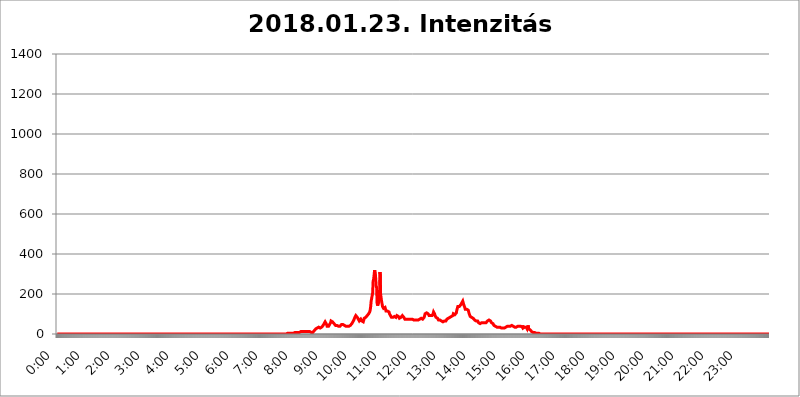
| Category | 2018.01.23. Intenzitás [W/m^2] |
|---|---|
| 0.0 | 0 |
| 0.0006944444444444445 | 0 |
| 0.001388888888888889 | 0 |
| 0.0020833333333333333 | 0 |
| 0.002777777777777778 | 0 |
| 0.003472222222222222 | 0 |
| 0.004166666666666667 | 0 |
| 0.004861111111111111 | 0 |
| 0.005555555555555556 | 0 |
| 0.0062499999999999995 | 0 |
| 0.006944444444444444 | 0 |
| 0.007638888888888889 | 0 |
| 0.008333333333333333 | 0 |
| 0.009027777777777779 | 0 |
| 0.009722222222222222 | 0 |
| 0.010416666666666666 | 0 |
| 0.011111111111111112 | 0 |
| 0.011805555555555555 | 0 |
| 0.012499999999999999 | 0 |
| 0.013194444444444444 | 0 |
| 0.013888888888888888 | 0 |
| 0.014583333333333332 | 0 |
| 0.015277777777777777 | 0 |
| 0.015972222222222224 | 0 |
| 0.016666666666666666 | 0 |
| 0.017361111111111112 | 0 |
| 0.018055555555555557 | 0 |
| 0.01875 | 0 |
| 0.019444444444444445 | 0 |
| 0.02013888888888889 | 0 |
| 0.020833333333333332 | 0 |
| 0.02152777777777778 | 0 |
| 0.022222222222222223 | 0 |
| 0.02291666666666667 | 0 |
| 0.02361111111111111 | 0 |
| 0.024305555555555556 | 0 |
| 0.024999999999999998 | 0 |
| 0.025694444444444447 | 0 |
| 0.02638888888888889 | 0 |
| 0.027083333333333334 | 0 |
| 0.027777777777777776 | 0 |
| 0.02847222222222222 | 0 |
| 0.029166666666666664 | 0 |
| 0.029861111111111113 | 0 |
| 0.030555555555555555 | 0 |
| 0.03125 | 0 |
| 0.03194444444444445 | 0 |
| 0.03263888888888889 | 0 |
| 0.03333333333333333 | 0 |
| 0.034027777777777775 | 0 |
| 0.034722222222222224 | 0 |
| 0.035416666666666666 | 0 |
| 0.036111111111111115 | 0 |
| 0.03680555555555556 | 0 |
| 0.0375 | 0 |
| 0.03819444444444444 | 0 |
| 0.03888888888888889 | 0 |
| 0.03958333333333333 | 0 |
| 0.04027777777777778 | 0 |
| 0.04097222222222222 | 0 |
| 0.041666666666666664 | 0 |
| 0.042361111111111106 | 0 |
| 0.04305555555555556 | 0 |
| 0.043750000000000004 | 0 |
| 0.044444444444444446 | 0 |
| 0.04513888888888889 | 0 |
| 0.04583333333333334 | 0 |
| 0.04652777777777778 | 0 |
| 0.04722222222222222 | 0 |
| 0.04791666666666666 | 0 |
| 0.04861111111111111 | 0 |
| 0.049305555555555554 | 0 |
| 0.049999999999999996 | 0 |
| 0.05069444444444445 | 0 |
| 0.051388888888888894 | 0 |
| 0.052083333333333336 | 0 |
| 0.05277777777777778 | 0 |
| 0.05347222222222222 | 0 |
| 0.05416666666666667 | 0 |
| 0.05486111111111111 | 0 |
| 0.05555555555555555 | 0 |
| 0.05625 | 0 |
| 0.05694444444444444 | 0 |
| 0.057638888888888885 | 0 |
| 0.05833333333333333 | 0 |
| 0.05902777777777778 | 0 |
| 0.059722222222222225 | 0 |
| 0.06041666666666667 | 0 |
| 0.061111111111111116 | 0 |
| 0.06180555555555556 | 0 |
| 0.0625 | 0 |
| 0.06319444444444444 | 0 |
| 0.06388888888888888 | 0 |
| 0.06458333333333334 | 0 |
| 0.06527777777777778 | 0 |
| 0.06597222222222222 | 0 |
| 0.06666666666666667 | 0 |
| 0.06736111111111111 | 0 |
| 0.06805555555555555 | 0 |
| 0.06874999999999999 | 0 |
| 0.06944444444444443 | 0 |
| 0.07013888888888889 | 0 |
| 0.07083333333333333 | 0 |
| 0.07152777777777779 | 0 |
| 0.07222222222222223 | 0 |
| 0.07291666666666667 | 0 |
| 0.07361111111111111 | 0 |
| 0.07430555555555556 | 0 |
| 0.075 | 0 |
| 0.07569444444444444 | 0 |
| 0.0763888888888889 | 0 |
| 0.07708333333333334 | 0 |
| 0.07777777777777778 | 0 |
| 0.07847222222222222 | 0 |
| 0.07916666666666666 | 0 |
| 0.0798611111111111 | 0 |
| 0.08055555555555556 | 0 |
| 0.08125 | 0 |
| 0.08194444444444444 | 0 |
| 0.08263888888888889 | 0 |
| 0.08333333333333333 | 0 |
| 0.08402777777777777 | 0 |
| 0.08472222222222221 | 0 |
| 0.08541666666666665 | 0 |
| 0.08611111111111112 | 0 |
| 0.08680555555555557 | 0 |
| 0.08750000000000001 | 0 |
| 0.08819444444444445 | 0 |
| 0.08888888888888889 | 0 |
| 0.08958333333333333 | 0 |
| 0.09027777777777778 | 0 |
| 0.09097222222222222 | 0 |
| 0.09166666666666667 | 0 |
| 0.09236111111111112 | 0 |
| 0.09305555555555556 | 0 |
| 0.09375 | 0 |
| 0.09444444444444444 | 0 |
| 0.09513888888888888 | 0 |
| 0.09583333333333333 | 0 |
| 0.09652777777777777 | 0 |
| 0.09722222222222222 | 0 |
| 0.09791666666666667 | 0 |
| 0.09861111111111111 | 0 |
| 0.09930555555555555 | 0 |
| 0.09999999999999999 | 0 |
| 0.10069444444444443 | 0 |
| 0.1013888888888889 | 0 |
| 0.10208333333333335 | 0 |
| 0.10277777777777779 | 0 |
| 0.10347222222222223 | 0 |
| 0.10416666666666667 | 0 |
| 0.10486111111111111 | 0 |
| 0.10555555555555556 | 0 |
| 0.10625 | 0 |
| 0.10694444444444444 | 0 |
| 0.1076388888888889 | 0 |
| 0.10833333333333334 | 0 |
| 0.10902777777777778 | 0 |
| 0.10972222222222222 | 0 |
| 0.1111111111111111 | 0 |
| 0.11180555555555556 | 0 |
| 0.11180555555555556 | 0 |
| 0.1125 | 0 |
| 0.11319444444444444 | 0 |
| 0.11388888888888889 | 0 |
| 0.11458333333333333 | 0 |
| 0.11527777777777777 | 0 |
| 0.11597222222222221 | 0 |
| 0.11666666666666665 | 0 |
| 0.1173611111111111 | 0 |
| 0.11805555555555557 | 0 |
| 0.11944444444444445 | 0 |
| 0.12013888888888889 | 0 |
| 0.12083333333333333 | 0 |
| 0.12152777777777778 | 0 |
| 0.12222222222222223 | 0 |
| 0.12291666666666667 | 0 |
| 0.12291666666666667 | 0 |
| 0.12361111111111112 | 0 |
| 0.12430555555555556 | 0 |
| 0.125 | 0 |
| 0.12569444444444444 | 0 |
| 0.12638888888888888 | 0 |
| 0.12708333333333333 | 0 |
| 0.16875 | 0 |
| 0.12847222222222224 | 0 |
| 0.12916666666666668 | 0 |
| 0.12986111111111112 | 0 |
| 0.13055555555555556 | 0 |
| 0.13125 | 0 |
| 0.13194444444444445 | 0 |
| 0.1326388888888889 | 0 |
| 0.13333333333333333 | 0 |
| 0.13402777777777777 | 0 |
| 0.13402777777777777 | 0 |
| 0.13472222222222222 | 0 |
| 0.13541666666666666 | 0 |
| 0.1361111111111111 | 0 |
| 0.13749999999999998 | 0 |
| 0.13819444444444443 | 0 |
| 0.1388888888888889 | 0 |
| 0.13958333333333334 | 0 |
| 0.14027777777777778 | 0 |
| 0.14097222222222222 | 0 |
| 0.14166666666666666 | 0 |
| 0.1423611111111111 | 0 |
| 0.14305555555555557 | 0 |
| 0.14375000000000002 | 0 |
| 0.14444444444444446 | 0 |
| 0.1451388888888889 | 0 |
| 0.1451388888888889 | 0 |
| 0.14652777777777778 | 0 |
| 0.14722222222222223 | 0 |
| 0.14791666666666667 | 0 |
| 0.1486111111111111 | 0 |
| 0.14930555555555555 | 0 |
| 0.15 | 0 |
| 0.15069444444444444 | 0 |
| 0.15138888888888888 | 0 |
| 0.15208333333333332 | 0 |
| 0.15277777777777776 | 0 |
| 0.15347222222222223 | 0 |
| 0.15416666666666667 | 0 |
| 0.15486111111111112 | 0 |
| 0.15555555555555556 | 0 |
| 0.15625 | 0 |
| 0.15694444444444444 | 0 |
| 0.15763888888888888 | 0 |
| 0.15833333333333333 | 0 |
| 0.15902777777777777 | 0 |
| 0.15972222222222224 | 0 |
| 0.16041666666666668 | 0 |
| 0.16111111111111112 | 0 |
| 0.16180555555555556 | 0 |
| 0.1625 | 0 |
| 0.16319444444444445 | 0 |
| 0.1638888888888889 | 0 |
| 0.16458333333333333 | 0 |
| 0.16527777777777777 | 0 |
| 0.16597222222222222 | 0 |
| 0.16666666666666666 | 0 |
| 0.1673611111111111 | 0 |
| 0.16805555555555554 | 0 |
| 0.16874999999999998 | 0 |
| 0.16944444444444443 | 0 |
| 0.17013888888888887 | 0 |
| 0.1708333333333333 | 0 |
| 0.17152777777777775 | 0 |
| 0.17222222222222225 | 0 |
| 0.1729166666666667 | 0 |
| 0.17361111111111113 | 0 |
| 0.17430555555555557 | 0 |
| 0.17500000000000002 | 0 |
| 0.17569444444444446 | 0 |
| 0.1763888888888889 | 0 |
| 0.17708333333333334 | 0 |
| 0.17777777777777778 | 0 |
| 0.17847222222222223 | 0 |
| 0.17916666666666667 | 0 |
| 0.1798611111111111 | 0 |
| 0.18055555555555555 | 0 |
| 0.18125 | 0 |
| 0.18194444444444444 | 0 |
| 0.1826388888888889 | 0 |
| 0.18333333333333335 | 0 |
| 0.1840277777777778 | 0 |
| 0.18472222222222223 | 0 |
| 0.18541666666666667 | 0 |
| 0.18611111111111112 | 0 |
| 0.18680555555555556 | 0 |
| 0.1875 | 0 |
| 0.18819444444444444 | 0 |
| 0.18888888888888888 | 0 |
| 0.18958333333333333 | 0 |
| 0.19027777777777777 | 0 |
| 0.1909722222222222 | 0 |
| 0.19166666666666665 | 0 |
| 0.19236111111111112 | 0 |
| 0.19305555555555554 | 0 |
| 0.19375 | 0 |
| 0.19444444444444445 | 0 |
| 0.1951388888888889 | 0 |
| 0.19583333333333333 | 0 |
| 0.19652777777777777 | 0 |
| 0.19722222222222222 | 0 |
| 0.19791666666666666 | 0 |
| 0.1986111111111111 | 0 |
| 0.19930555555555554 | 0 |
| 0.19999999999999998 | 0 |
| 0.20069444444444443 | 0 |
| 0.20138888888888887 | 0 |
| 0.2020833333333333 | 0 |
| 0.2027777777777778 | 0 |
| 0.2034722222222222 | 0 |
| 0.2041666666666667 | 0 |
| 0.20486111111111113 | 0 |
| 0.20555555555555557 | 0 |
| 0.20625000000000002 | 0 |
| 0.20694444444444446 | 0 |
| 0.2076388888888889 | 0 |
| 0.20833333333333334 | 0 |
| 0.20902777777777778 | 0 |
| 0.20972222222222223 | 0 |
| 0.21041666666666667 | 0 |
| 0.2111111111111111 | 0 |
| 0.21180555555555555 | 0 |
| 0.2125 | 0 |
| 0.21319444444444444 | 0 |
| 0.2138888888888889 | 0 |
| 0.21458333333333335 | 0 |
| 0.2152777777777778 | 0 |
| 0.21597222222222223 | 0 |
| 0.21666666666666667 | 0 |
| 0.21736111111111112 | 0 |
| 0.21805555555555556 | 0 |
| 0.21875 | 0 |
| 0.21944444444444444 | 0 |
| 0.22013888888888888 | 0 |
| 0.22083333333333333 | 0 |
| 0.22152777777777777 | 0 |
| 0.2222222222222222 | 0 |
| 0.22291666666666665 | 0 |
| 0.2236111111111111 | 0 |
| 0.22430555555555556 | 0 |
| 0.225 | 0 |
| 0.22569444444444445 | 0 |
| 0.2263888888888889 | 0 |
| 0.22708333333333333 | 0 |
| 0.22777777777777777 | 0 |
| 0.22847222222222222 | 0 |
| 0.22916666666666666 | 0 |
| 0.2298611111111111 | 0 |
| 0.23055555555555554 | 0 |
| 0.23124999999999998 | 0 |
| 0.23194444444444443 | 0 |
| 0.23263888888888887 | 0 |
| 0.2333333333333333 | 0 |
| 0.2340277777777778 | 0 |
| 0.2347222222222222 | 0 |
| 0.2354166666666667 | 0 |
| 0.23611111111111113 | 0 |
| 0.23680555555555557 | 0 |
| 0.23750000000000002 | 0 |
| 0.23819444444444446 | 0 |
| 0.2388888888888889 | 0 |
| 0.23958333333333334 | 0 |
| 0.24027777777777778 | 0 |
| 0.24097222222222223 | 0 |
| 0.24166666666666667 | 0 |
| 0.2423611111111111 | 0 |
| 0.24305555555555555 | 0 |
| 0.24375 | 0 |
| 0.24444444444444446 | 0 |
| 0.24513888888888888 | 0 |
| 0.24583333333333335 | 0 |
| 0.2465277777777778 | 0 |
| 0.24722222222222223 | 0 |
| 0.24791666666666667 | 0 |
| 0.24861111111111112 | 0 |
| 0.24930555555555556 | 0 |
| 0.25 | 0 |
| 0.25069444444444444 | 0 |
| 0.2513888888888889 | 0 |
| 0.2520833333333333 | 0 |
| 0.25277777777777777 | 0 |
| 0.2534722222222222 | 0 |
| 0.25416666666666665 | 0 |
| 0.2548611111111111 | 0 |
| 0.2555555555555556 | 0 |
| 0.25625000000000003 | 0 |
| 0.2569444444444445 | 0 |
| 0.2576388888888889 | 0 |
| 0.25833333333333336 | 0 |
| 0.2590277777777778 | 0 |
| 0.25972222222222224 | 0 |
| 0.2604166666666667 | 0 |
| 0.2611111111111111 | 0 |
| 0.26180555555555557 | 0 |
| 0.2625 | 0 |
| 0.26319444444444445 | 0 |
| 0.2638888888888889 | 0 |
| 0.26458333333333334 | 0 |
| 0.2652777777777778 | 0 |
| 0.2659722222222222 | 0 |
| 0.26666666666666666 | 0 |
| 0.2673611111111111 | 0 |
| 0.26805555555555555 | 0 |
| 0.26875 | 0 |
| 0.26944444444444443 | 0 |
| 0.2701388888888889 | 0 |
| 0.2708333333333333 | 0 |
| 0.27152777777777776 | 0 |
| 0.2722222222222222 | 0 |
| 0.27291666666666664 | 0 |
| 0.2736111111111111 | 0 |
| 0.2743055555555555 | 0 |
| 0.27499999999999997 | 0 |
| 0.27569444444444446 | 0 |
| 0.27638888888888885 | 0 |
| 0.27708333333333335 | 0 |
| 0.2777777777777778 | 0 |
| 0.27847222222222223 | 0 |
| 0.2791666666666667 | 0 |
| 0.2798611111111111 | 0 |
| 0.28055555555555556 | 0 |
| 0.28125 | 0 |
| 0.28194444444444444 | 0 |
| 0.2826388888888889 | 0 |
| 0.2833333333333333 | 0 |
| 0.28402777777777777 | 0 |
| 0.2847222222222222 | 0 |
| 0.28541666666666665 | 0 |
| 0.28611111111111115 | 0 |
| 0.28680555555555554 | 0 |
| 0.28750000000000003 | 0 |
| 0.2881944444444445 | 0 |
| 0.2888888888888889 | 0 |
| 0.28958333333333336 | 0 |
| 0.2902777777777778 | 0 |
| 0.29097222222222224 | 0 |
| 0.2916666666666667 | 0 |
| 0.2923611111111111 | 0 |
| 0.29305555555555557 | 0 |
| 0.29375 | 0 |
| 0.29444444444444445 | 0 |
| 0.2951388888888889 | 0 |
| 0.29583333333333334 | 0 |
| 0.2965277777777778 | 0 |
| 0.2972222222222222 | 0 |
| 0.29791666666666666 | 0 |
| 0.2986111111111111 | 0 |
| 0.29930555555555555 | 0 |
| 0.3 | 0 |
| 0.30069444444444443 | 0 |
| 0.3013888888888889 | 0 |
| 0.3020833333333333 | 0 |
| 0.30277777777777776 | 0 |
| 0.3034722222222222 | 0 |
| 0.30416666666666664 | 0 |
| 0.3048611111111111 | 0 |
| 0.3055555555555555 | 0 |
| 0.30624999999999997 | 0 |
| 0.3069444444444444 | 0 |
| 0.3076388888888889 | 0 |
| 0.30833333333333335 | 0 |
| 0.3090277777777778 | 0 |
| 0.30972222222222223 | 0 |
| 0.3104166666666667 | 0 |
| 0.3111111111111111 | 0 |
| 0.31180555555555556 | 0 |
| 0.3125 | 0 |
| 0.31319444444444444 | 0 |
| 0.3138888888888889 | 0 |
| 0.3145833333333333 | 0 |
| 0.31527777777777777 | 0 |
| 0.3159722222222222 | 0 |
| 0.31666666666666665 | 0 |
| 0.31736111111111115 | 0 |
| 0.31805555555555554 | 0 |
| 0.31875000000000003 | 0 |
| 0.3194444444444445 | 0 |
| 0.3201388888888889 | 0 |
| 0.32083333333333336 | 0 |
| 0.3215277777777778 | 0 |
| 0.32222222222222224 | 3.525 |
| 0.3229166666666667 | 3.525 |
| 0.3236111111111111 | 0 |
| 0.32430555555555557 | 3.525 |
| 0.325 | 3.525 |
| 0.32569444444444445 | 3.525 |
| 0.3263888888888889 | 3.525 |
| 0.32708333333333334 | 3.525 |
| 0.3277777777777778 | 3.525 |
| 0.3284722222222222 | 3.525 |
| 0.32916666666666666 | 3.525 |
| 0.3298611111111111 | 3.525 |
| 0.33055555555555555 | 3.525 |
| 0.33125 | 3.525 |
| 0.33194444444444443 | 3.525 |
| 0.3326388888888889 | 3.525 |
| 0.3333333333333333 | 7.887 |
| 0.3340277777777778 | 7.887 |
| 0.3347222222222222 | 7.887 |
| 0.3354166666666667 | 7.887 |
| 0.3361111111111111 | 7.887 |
| 0.3368055555555556 | 7.887 |
| 0.33749999999999997 | 7.887 |
| 0.33819444444444446 | 7.887 |
| 0.33888888888888885 | 7.887 |
| 0.33958333333333335 | 7.887 |
| 0.34027777777777773 | 12.257 |
| 0.34097222222222223 | 12.257 |
| 0.3416666666666666 | 12.257 |
| 0.3423611111111111 | 12.257 |
| 0.3430555555555555 | 12.257 |
| 0.34375 | 12.257 |
| 0.3444444444444445 | 12.257 |
| 0.3451388888888889 | 12.257 |
| 0.3458333333333334 | 12.257 |
| 0.34652777777777777 | 12.257 |
| 0.34722222222222227 | 12.257 |
| 0.34791666666666665 | 12.257 |
| 0.34861111111111115 | 12.257 |
| 0.34930555555555554 | 12.257 |
| 0.35000000000000003 | 12.257 |
| 0.3506944444444444 | 12.257 |
| 0.3513888888888889 | 12.257 |
| 0.3520833333333333 | 12.257 |
| 0.3527777777777778 | 12.257 |
| 0.3534722222222222 | 12.257 |
| 0.3541666666666667 | 12.257 |
| 0.3548611111111111 | 7.887 |
| 0.35555555555555557 | 7.887 |
| 0.35625 | 7.887 |
| 0.35694444444444445 | 3.525 |
| 0.3576388888888889 | 7.887 |
| 0.35833333333333334 | 7.887 |
| 0.3590277777777778 | 7.887 |
| 0.3597222222222222 | 12.257 |
| 0.36041666666666666 | 16.636 |
| 0.3611111111111111 | 21.024 |
| 0.36180555555555555 | 21.024 |
| 0.3625 | 25.419 |
| 0.36319444444444443 | 29.823 |
| 0.3638888888888889 | 29.823 |
| 0.3645833333333333 | 29.823 |
| 0.3652777777777778 | 34.234 |
| 0.3659722222222222 | 34.234 |
| 0.3666666666666667 | 34.234 |
| 0.3673611111111111 | 34.234 |
| 0.3680555555555556 | 29.823 |
| 0.36874999999999997 | 29.823 |
| 0.36944444444444446 | 29.823 |
| 0.37013888888888885 | 29.823 |
| 0.37083333333333335 | 34.234 |
| 0.37152777777777773 | 38.653 |
| 0.37222222222222223 | 38.653 |
| 0.3729166666666666 | 43.079 |
| 0.3736111111111111 | 47.511 |
| 0.3743055555555555 | 51.951 |
| 0.375 | 56.398 |
| 0.3756944444444445 | 60.85 |
| 0.3763888888888889 | 60.85 |
| 0.3770833333333334 | 60.85 |
| 0.37777777777777777 | 47.511 |
| 0.37847222222222227 | 38.653 |
| 0.37916666666666665 | 34.234 |
| 0.37986111111111115 | 34.234 |
| 0.38055555555555554 | 38.653 |
| 0.38125000000000003 | 43.079 |
| 0.3819444444444444 | 47.511 |
| 0.3826388888888889 | 51.951 |
| 0.3833333333333333 | 56.398 |
| 0.3840277777777778 | 65.31 |
| 0.3847222222222222 | 69.775 |
| 0.3854166666666667 | 65.31 |
| 0.3861111111111111 | 60.85 |
| 0.38680555555555557 | 60.85 |
| 0.3875 | 56.398 |
| 0.38819444444444445 | 51.951 |
| 0.3888888888888889 | 47.511 |
| 0.38958333333333334 | 47.511 |
| 0.3902777777777778 | 43.079 |
| 0.3909722222222222 | 38.653 |
| 0.39166666666666666 | 38.653 |
| 0.3923611111111111 | 43.079 |
| 0.39305555555555555 | 43.079 |
| 0.39375 | 43.079 |
| 0.39444444444444443 | 38.653 |
| 0.3951388888888889 | 38.653 |
| 0.3958333333333333 | 38.653 |
| 0.3965277777777778 | 38.653 |
| 0.3972222222222222 | 38.653 |
| 0.3979166666666667 | 43.079 |
| 0.3986111111111111 | 47.511 |
| 0.3993055555555556 | 47.511 |
| 0.39999999999999997 | 51.951 |
| 0.40069444444444446 | 47.511 |
| 0.40138888888888885 | 47.511 |
| 0.40208333333333335 | 47.511 |
| 0.40277777777777773 | 43.079 |
| 0.40347222222222223 | 38.653 |
| 0.4041666666666666 | 38.653 |
| 0.4048611111111111 | 38.653 |
| 0.4055555555555555 | 38.653 |
| 0.40625 | 38.653 |
| 0.4069444444444445 | 38.653 |
| 0.4076388888888889 | 38.653 |
| 0.4083333333333334 | 38.653 |
| 0.40902777777777777 | 38.653 |
| 0.40972222222222227 | 38.653 |
| 0.41041666666666665 | 38.653 |
| 0.41111111111111115 | 43.079 |
| 0.41180555555555554 | 43.079 |
| 0.41250000000000003 | 47.511 |
| 0.4131944444444444 | 51.951 |
| 0.4138888888888889 | 56.398 |
| 0.4145833333333333 | 60.85 |
| 0.4152777777777778 | 65.31 |
| 0.4159722222222222 | 69.775 |
| 0.4166666666666667 | 74.246 |
| 0.4173611111111111 | 83.205 |
| 0.41805555555555557 | 87.692 |
| 0.41875 | 92.184 |
| 0.41944444444444445 | 87.692 |
| 0.4201388888888889 | 87.692 |
| 0.42083333333333334 | 83.205 |
| 0.4215277777777778 | 78.722 |
| 0.4222222222222222 | 74.246 |
| 0.42291666666666666 | 69.775 |
| 0.4236111111111111 | 65.31 |
| 0.42430555555555555 | 65.31 |
| 0.425 | 69.775 |
| 0.42569444444444443 | 74.246 |
| 0.4263888888888889 | 69.775 |
| 0.4270833333333333 | 65.31 |
| 0.4277777777777778 | 60.85 |
| 0.4284722222222222 | 60.85 |
| 0.4291666666666667 | 60.85 |
| 0.4298611111111111 | 65.31 |
| 0.4305555555555556 | 78.722 |
| 0.43124999999999997 | 83.205 |
| 0.43194444444444446 | 83.205 |
| 0.43263888888888885 | 83.205 |
| 0.43333333333333335 | 83.205 |
| 0.43402777777777773 | 87.692 |
| 0.43472222222222223 | 92.184 |
| 0.4354166666666666 | 92.184 |
| 0.4361111111111111 | 96.682 |
| 0.4368055555555555 | 101.184 |
| 0.4375 | 105.69 |
| 0.4381944444444445 | 110.201 |
| 0.4388888888888889 | 119.235 |
| 0.4395833333333334 | 137.347 |
| 0.44027777777777777 | 164.605 |
| 0.44097222222222227 | 178.264 |
| 0.44166666666666665 | 182.82 |
| 0.44236111111111115 | 205.62 |
| 0.44305555555555554 | 264.932 |
| 0.44375000000000003 | 274.047 |
| 0.4444444444444444 | 296.808 |
| 0.4451388888888889 | 319.517 |
| 0.4458333333333333 | 314.98 |
| 0.4465277777777778 | 283.156 |
| 0.4472222222222222 | 242.127 |
| 0.4479166666666667 | 233 |
| 0.4486111111111111 | 155.509 |
| 0.44930555555555557 | 141.884 |
| 0.45 | 146.423 |
| 0.45069444444444445 | 160.056 |
| 0.4513888888888889 | 182.82 |
| 0.45208333333333334 | 210.182 |
| 0.4527777777777778 | 310.44 |
| 0.4534722222222222 | 201.058 |
| 0.45416666666666666 | 182.82 |
| 0.4548611111111111 | 164.605 |
| 0.45555555555555555 | 150.964 |
| 0.45625 | 137.347 |
| 0.45694444444444443 | 132.814 |
| 0.4576388888888889 | 128.284 |
| 0.4583333333333333 | 128.284 |
| 0.4590277777777778 | 132.814 |
| 0.4597222222222222 | 132.814 |
| 0.4604166666666667 | 123.758 |
| 0.4611111111111111 | 114.716 |
| 0.4618055555555556 | 110.201 |
| 0.46249999999999997 | 110.201 |
| 0.46319444444444446 | 114.716 |
| 0.46388888888888885 | 114.716 |
| 0.46458333333333335 | 114.716 |
| 0.46527777777777773 | 110.201 |
| 0.46597222222222223 | 101.184 |
| 0.4666666666666666 | 96.682 |
| 0.4673611111111111 | 92.184 |
| 0.4680555555555555 | 87.692 |
| 0.46875 | 83.205 |
| 0.4694444444444445 | 83.205 |
| 0.4701388888888889 | 87.692 |
| 0.4708333333333334 | 83.205 |
| 0.47152777777777777 | 83.205 |
| 0.47222222222222227 | 87.692 |
| 0.47291666666666665 | 87.692 |
| 0.47361111111111115 | 87.692 |
| 0.47430555555555554 | 87.692 |
| 0.47500000000000003 | 83.205 |
| 0.4756944444444444 | 83.205 |
| 0.4763888888888889 | 92.184 |
| 0.4770833333333333 | 92.184 |
| 0.4777777777777778 | 92.184 |
| 0.4784722222222222 | 87.692 |
| 0.4791666666666667 | 83.205 |
| 0.4798611111111111 | 78.722 |
| 0.48055555555555557 | 83.205 |
| 0.48125 | 83.205 |
| 0.48194444444444445 | 83.205 |
| 0.4826388888888889 | 83.205 |
| 0.48333333333333334 | 87.692 |
| 0.4840277777777778 | 92.184 |
| 0.4847222222222222 | 92.184 |
| 0.48541666666666666 | 87.692 |
| 0.4861111111111111 | 83.205 |
| 0.48680555555555555 | 78.722 |
| 0.4875 | 74.246 |
| 0.48819444444444443 | 74.246 |
| 0.4888888888888889 | 74.246 |
| 0.4895833333333333 | 74.246 |
| 0.4902777777777778 | 74.246 |
| 0.4909722222222222 | 74.246 |
| 0.4916666666666667 | 74.246 |
| 0.4923611111111111 | 74.246 |
| 0.4930555555555556 | 74.246 |
| 0.49374999999999997 | 74.246 |
| 0.49444444444444446 | 74.246 |
| 0.49513888888888885 | 74.246 |
| 0.49583333333333335 | 74.246 |
| 0.49652777777777773 | 74.246 |
| 0.49722222222222223 | 74.246 |
| 0.4979166666666666 | 74.246 |
| 0.4986111111111111 | 69.775 |
| 0.4993055555555555 | 69.775 |
| 0.5 | 69.775 |
| 0.5006944444444444 | 69.775 |
| 0.5013888888888889 | 69.775 |
| 0.5020833333333333 | 69.775 |
| 0.5027777777777778 | 69.775 |
| 0.5034722222222222 | 69.775 |
| 0.5041666666666667 | 69.775 |
| 0.5048611111111111 | 74.246 |
| 0.5055555555555555 | 74.246 |
| 0.50625 | 69.775 |
| 0.5069444444444444 | 69.775 |
| 0.5076388888888889 | 74.246 |
| 0.5083333333333333 | 74.246 |
| 0.5090277777777777 | 74.246 |
| 0.5097222222222222 | 78.722 |
| 0.5104166666666666 | 78.722 |
| 0.5111111111111112 | 78.722 |
| 0.5118055555555555 | 78.722 |
| 0.5125000000000001 | 74.246 |
| 0.5131944444444444 | 74.246 |
| 0.513888888888889 | 74.246 |
| 0.5145833333333333 | 83.205 |
| 0.5152777777777778 | 92.184 |
| 0.5159722222222222 | 101.184 |
| 0.5166666666666667 | 101.184 |
| 0.517361111111111 | 105.69 |
| 0.5180555555555556 | 105.69 |
| 0.5187499999999999 | 105.69 |
| 0.5194444444444445 | 105.69 |
| 0.5201388888888888 | 101.184 |
| 0.5208333333333334 | 96.682 |
| 0.5215277777777778 | 92.184 |
| 0.5222222222222223 | 92.184 |
| 0.5229166666666667 | 92.184 |
| 0.5236111111111111 | 92.184 |
| 0.5243055555555556 | 92.184 |
| 0.525 | 92.184 |
| 0.5256944444444445 | 92.184 |
| 0.5263888888888889 | 92.184 |
| 0.5270833333333333 | 101.184 |
| 0.5277777777777778 | 110.201 |
| 0.5284722222222222 | 110.201 |
| 0.5291666666666667 | 101.184 |
| 0.5298611111111111 | 92.184 |
| 0.5305555555555556 | 87.692 |
| 0.53125 | 83.205 |
| 0.5319444444444444 | 83.205 |
| 0.5326388888888889 | 83.205 |
| 0.5333333333333333 | 78.722 |
| 0.5340277777777778 | 74.246 |
| 0.5347222222222222 | 69.775 |
| 0.5354166666666667 | 69.775 |
| 0.5361111111111111 | 69.775 |
| 0.5368055555555555 | 69.775 |
| 0.5375 | 65.31 |
| 0.5381944444444444 | 65.31 |
| 0.5388888888888889 | 65.31 |
| 0.5395833333333333 | 65.31 |
| 0.5402777777777777 | 65.31 |
| 0.5409722222222222 | 60.85 |
| 0.5416666666666666 | 60.85 |
| 0.5423611111111112 | 60.85 |
| 0.5430555555555555 | 65.31 |
| 0.5437500000000001 | 65.31 |
| 0.5444444444444444 | 65.31 |
| 0.545138888888889 | 65.31 |
| 0.5458333333333333 | 69.775 |
| 0.5465277777777778 | 74.246 |
| 0.5472222222222222 | 74.246 |
| 0.5479166666666667 | 74.246 |
| 0.548611111111111 | 78.722 |
| 0.5493055555555556 | 78.722 |
| 0.5499999999999999 | 78.722 |
| 0.5506944444444445 | 83.205 |
| 0.5513888888888888 | 83.205 |
| 0.5520833333333334 | 87.692 |
| 0.5527777777777778 | 87.692 |
| 0.5534722222222223 | 87.692 |
| 0.5541666666666667 | 87.692 |
| 0.5548611111111111 | 92.184 |
| 0.5555555555555556 | 101.184 |
| 0.55625 | 105.69 |
| 0.5569444444444445 | 101.184 |
| 0.5576388888888889 | 96.682 |
| 0.5583333333333333 | 96.682 |
| 0.5590277777777778 | 96.682 |
| 0.5597222222222222 | 105.69 |
| 0.5604166666666667 | 119.235 |
| 0.5611111111111111 | 128.284 |
| 0.5618055555555556 | 137.347 |
| 0.5625 | 137.347 |
| 0.5631944444444444 | 137.347 |
| 0.5638888888888889 | 137.347 |
| 0.5645833333333333 | 137.347 |
| 0.5652777777777778 | 141.884 |
| 0.5659722222222222 | 146.423 |
| 0.5666666666666667 | 150.964 |
| 0.5673611111111111 | 155.509 |
| 0.5680555555555555 | 160.056 |
| 0.56875 | 164.605 |
| 0.5694444444444444 | 155.509 |
| 0.5701388888888889 | 146.423 |
| 0.5708333333333333 | 141.884 |
| 0.5715277777777777 | 132.814 |
| 0.5722222222222222 | 123.758 |
| 0.5729166666666666 | 123.758 |
| 0.5736111111111112 | 123.758 |
| 0.5743055555555555 | 123.758 |
| 0.5750000000000001 | 119.235 |
| 0.5756944444444444 | 123.758 |
| 0.576388888888889 | 119.235 |
| 0.5770833333333333 | 110.201 |
| 0.5777777777777778 | 101.184 |
| 0.5784722222222222 | 96.682 |
| 0.5791666666666667 | 87.692 |
| 0.579861111111111 | 83.205 |
| 0.5805555555555556 | 83.205 |
| 0.5812499999999999 | 83.205 |
| 0.5819444444444445 | 83.205 |
| 0.5826388888888888 | 78.722 |
| 0.5833333333333334 | 78.722 |
| 0.5840277777777778 | 74.246 |
| 0.5847222222222223 | 74.246 |
| 0.5854166666666667 | 69.775 |
| 0.5861111111111111 | 69.775 |
| 0.5868055555555556 | 69.775 |
| 0.5875 | 65.31 |
| 0.5881944444444445 | 65.31 |
| 0.5888888888888889 | 65.31 |
| 0.5895833333333333 | 65.31 |
| 0.5902777777777778 | 60.85 |
| 0.5909722222222222 | 56.398 |
| 0.5916666666666667 | 51.951 |
| 0.5923611111111111 | 51.951 |
| 0.5930555555555556 | 51.951 |
| 0.59375 | 51.951 |
| 0.5944444444444444 | 56.398 |
| 0.5951388888888889 | 56.398 |
| 0.5958333333333333 | 56.398 |
| 0.5965277777777778 | 56.398 |
| 0.5972222222222222 | 56.398 |
| 0.5979166666666667 | 56.398 |
| 0.5986111111111111 | 56.398 |
| 0.5993055555555555 | 56.398 |
| 0.6 | 56.398 |
| 0.6006944444444444 | 56.398 |
| 0.6013888888888889 | 56.398 |
| 0.6020833333333333 | 60.85 |
| 0.6027777777777777 | 60.85 |
| 0.6034722222222222 | 65.31 |
| 0.6041666666666666 | 65.31 |
| 0.6048611111111112 | 69.775 |
| 0.6055555555555555 | 69.775 |
| 0.6062500000000001 | 69.775 |
| 0.6069444444444444 | 65.31 |
| 0.607638888888889 | 65.31 |
| 0.6083333333333333 | 60.85 |
| 0.6090277777777778 | 56.398 |
| 0.6097222222222222 | 56.398 |
| 0.6104166666666667 | 51.951 |
| 0.611111111111111 | 51.951 |
| 0.6118055555555556 | 47.511 |
| 0.6124999999999999 | 43.079 |
| 0.6131944444444445 | 38.653 |
| 0.6138888888888888 | 38.653 |
| 0.6145833333333334 | 38.653 |
| 0.6152777777777778 | 38.653 |
| 0.6159722222222223 | 34.234 |
| 0.6166666666666667 | 34.234 |
| 0.6173611111111111 | 34.234 |
| 0.6180555555555556 | 34.234 |
| 0.61875 | 34.234 |
| 0.6194444444444445 | 34.234 |
| 0.6201388888888889 | 34.234 |
| 0.6208333333333333 | 34.234 |
| 0.6215277777777778 | 34.234 |
| 0.6222222222222222 | 29.823 |
| 0.6229166666666667 | 29.823 |
| 0.6236111111111111 | 29.823 |
| 0.6243055555555556 | 29.823 |
| 0.625 | 29.823 |
| 0.6256944444444444 | 25.419 |
| 0.6263888888888889 | 25.419 |
| 0.6270833333333333 | 29.823 |
| 0.6277777777777778 | 29.823 |
| 0.6284722222222222 | 29.823 |
| 0.6291666666666667 | 34.234 |
| 0.6298611111111111 | 34.234 |
| 0.6305555555555555 | 38.653 |
| 0.63125 | 38.653 |
| 0.6319444444444444 | 38.653 |
| 0.6326388888888889 | 38.653 |
| 0.6333333333333333 | 38.653 |
| 0.6340277777777777 | 38.653 |
| 0.6347222222222222 | 38.653 |
| 0.6354166666666666 | 38.653 |
| 0.6361111111111112 | 38.653 |
| 0.6368055555555555 | 43.079 |
| 0.6375000000000001 | 43.079 |
| 0.6381944444444444 | 38.653 |
| 0.638888888888889 | 38.653 |
| 0.6395833333333333 | 38.653 |
| 0.6402777777777778 | 34.234 |
| 0.6409722222222222 | 34.234 |
| 0.6416666666666667 | 34.234 |
| 0.642361111111111 | 34.234 |
| 0.6430555555555556 | 34.234 |
| 0.6437499999999999 | 34.234 |
| 0.6444444444444445 | 34.234 |
| 0.6451388888888888 | 34.234 |
| 0.6458333333333334 | 38.653 |
| 0.6465277777777778 | 38.653 |
| 0.6472222222222223 | 38.653 |
| 0.6479166666666667 | 38.653 |
| 0.6486111111111111 | 38.653 |
| 0.6493055555555556 | 38.653 |
| 0.65 | 38.653 |
| 0.6506944444444445 | 34.234 |
| 0.6513888888888889 | 34.234 |
| 0.6520833333333333 | 34.234 |
| 0.6527777777777778 | 43.079 |
| 0.6534722222222222 | 29.823 |
| 0.6541666666666667 | 29.823 |
| 0.6548611111111111 | 34.234 |
| 0.6555555555555556 | 34.234 |
| 0.65625 | 34.234 |
| 0.6569444444444444 | 29.823 |
| 0.6576388888888889 | 34.234 |
| 0.6583333333333333 | 29.823 |
| 0.6590277777777778 | 25.419 |
| 0.6597222222222222 | 34.234 |
| 0.6604166666666667 | 43.079 |
| 0.6611111111111111 | 25.419 |
| 0.6618055555555555 | 25.419 |
| 0.6625 | 29.823 |
| 0.6631944444444444 | 21.024 |
| 0.6638888888888889 | 21.024 |
| 0.6645833333333333 | 16.636 |
| 0.6652777777777777 | 12.257 |
| 0.6659722222222222 | 12.257 |
| 0.6666666666666666 | 12.257 |
| 0.6673611111111111 | 7.887 |
| 0.6680555555555556 | 7.887 |
| 0.6687500000000001 | 7.887 |
| 0.6694444444444444 | 7.887 |
| 0.6701388888888888 | 3.525 |
| 0.6708333333333334 | 3.525 |
| 0.6715277777777778 | 3.525 |
| 0.6722222222222222 | 3.525 |
| 0.6729166666666666 | 3.525 |
| 0.6736111111111112 | 3.525 |
| 0.6743055555555556 | 3.525 |
| 0.6749999999999999 | 3.525 |
| 0.6756944444444444 | 3.525 |
| 0.6763888888888889 | 3.525 |
| 0.6770833333333334 | 3.525 |
| 0.6777777777777777 | 0 |
| 0.6784722222222223 | 0 |
| 0.6791666666666667 | 0 |
| 0.6798611111111111 | 0 |
| 0.6805555555555555 | 0 |
| 0.68125 | 0 |
| 0.6819444444444445 | 0 |
| 0.6826388888888889 | 0 |
| 0.6833333333333332 | 0 |
| 0.6840277777777778 | 0 |
| 0.6847222222222222 | 0 |
| 0.6854166666666667 | 0 |
| 0.686111111111111 | 0 |
| 0.6868055555555556 | 0 |
| 0.6875 | 0 |
| 0.6881944444444444 | 0 |
| 0.688888888888889 | 0 |
| 0.6895833333333333 | 0 |
| 0.6902777777777778 | 0 |
| 0.6909722222222222 | 0 |
| 0.6916666666666668 | 0 |
| 0.6923611111111111 | 0 |
| 0.6930555555555555 | 0 |
| 0.69375 | 0 |
| 0.6944444444444445 | 0 |
| 0.6951388888888889 | 0 |
| 0.6958333333333333 | 0 |
| 0.6965277777777777 | 0 |
| 0.6972222222222223 | 0 |
| 0.6979166666666666 | 0 |
| 0.6986111111111111 | 0 |
| 0.6993055555555556 | 0 |
| 0.7000000000000001 | 0 |
| 0.7006944444444444 | 0 |
| 0.7013888888888888 | 0 |
| 0.7020833333333334 | 0 |
| 0.7027777777777778 | 0 |
| 0.7034722222222222 | 0 |
| 0.7041666666666666 | 0 |
| 0.7048611111111112 | 0 |
| 0.7055555555555556 | 0 |
| 0.7062499999999999 | 0 |
| 0.7069444444444444 | 0 |
| 0.7076388888888889 | 0 |
| 0.7083333333333334 | 0 |
| 0.7090277777777777 | 0 |
| 0.7097222222222223 | 0 |
| 0.7104166666666667 | 0 |
| 0.7111111111111111 | 0 |
| 0.7118055555555555 | 0 |
| 0.7125 | 0 |
| 0.7131944444444445 | 0 |
| 0.7138888888888889 | 0 |
| 0.7145833333333332 | 0 |
| 0.7152777777777778 | 0 |
| 0.7159722222222222 | 0 |
| 0.7166666666666667 | 0 |
| 0.717361111111111 | 0 |
| 0.7180555555555556 | 0 |
| 0.71875 | 0 |
| 0.7194444444444444 | 0 |
| 0.720138888888889 | 0 |
| 0.7208333333333333 | 0 |
| 0.7215277777777778 | 0 |
| 0.7222222222222222 | 0 |
| 0.7229166666666668 | 0 |
| 0.7236111111111111 | 0 |
| 0.7243055555555555 | 0 |
| 0.725 | 0 |
| 0.7256944444444445 | 0 |
| 0.7263888888888889 | 0 |
| 0.7270833333333333 | 0 |
| 0.7277777777777777 | 0 |
| 0.7284722222222223 | 0 |
| 0.7291666666666666 | 0 |
| 0.7298611111111111 | 0 |
| 0.7305555555555556 | 0 |
| 0.7312500000000001 | 0 |
| 0.7319444444444444 | 0 |
| 0.7326388888888888 | 0 |
| 0.7333333333333334 | 0 |
| 0.7340277777777778 | 0 |
| 0.7347222222222222 | 0 |
| 0.7354166666666666 | 0 |
| 0.7361111111111112 | 0 |
| 0.7368055555555556 | 0 |
| 0.7374999999999999 | 0 |
| 0.7381944444444444 | 0 |
| 0.7388888888888889 | 0 |
| 0.7395833333333334 | 0 |
| 0.7402777777777777 | 0 |
| 0.7409722222222223 | 0 |
| 0.7416666666666667 | 0 |
| 0.7423611111111111 | 0 |
| 0.7430555555555555 | 0 |
| 0.74375 | 0 |
| 0.7444444444444445 | 0 |
| 0.7451388888888889 | 0 |
| 0.7458333333333332 | 0 |
| 0.7465277777777778 | 0 |
| 0.7472222222222222 | 0 |
| 0.7479166666666667 | 0 |
| 0.748611111111111 | 0 |
| 0.7493055555555556 | 0 |
| 0.75 | 0 |
| 0.7506944444444444 | 0 |
| 0.751388888888889 | 0 |
| 0.7520833333333333 | 0 |
| 0.7527777777777778 | 0 |
| 0.7534722222222222 | 0 |
| 0.7541666666666668 | 0 |
| 0.7548611111111111 | 0 |
| 0.7555555555555555 | 0 |
| 0.75625 | 0 |
| 0.7569444444444445 | 0 |
| 0.7576388888888889 | 0 |
| 0.7583333333333333 | 0 |
| 0.7590277777777777 | 0 |
| 0.7597222222222223 | 0 |
| 0.7604166666666666 | 0 |
| 0.7611111111111111 | 0 |
| 0.7618055555555556 | 0 |
| 0.7625000000000001 | 0 |
| 0.7631944444444444 | 0 |
| 0.7638888888888888 | 0 |
| 0.7645833333333334 | 0 |
| 0.7652777777777778 | 0 |
| 0.7659722222222222 | 0 |
| 0.7666666666666666 | 0 |
| 0.7673611111111112 | 0 |
| 0.7680555555555556 | 0 |
| 0.7687499999999999 | 0 |
| 0.7694444444444444 | 0 |
| 0.7701388888888889 | 0 |
| 0.7708333333333334 | 0 |
| 0.7715277777777777 | 0 |
| 0.7722222222222223 | 0 |
| 0.7729166666666667 | 0 |
| 0.7736111111111111 | 0 |
| 0.7743055555555555 | 0 |
| 0.775 | 0 |
| 0.7756944444444445 | 0 |
| 0.7763888888888889 | 0 |
| 0.7770833333333332 | 0 |
| 0.7777777777777778 | 0 |
| 0.7784722222222222 | 0 |
| 0.7791666666666667 | 0 |
| 0.779861111111111 | 0 |
| 0.7805555555555556 | 0 |
| 0.78125 | 0 |
| 0.7819444444444444 | 0 |
| 0.782638888888889 | 0 |
| 0.7833333333333333 | 0 |
| 0.7840277777777778 | 0 |
| 0.7847222222222222 | 0 |
| 0.7854166666666668 | 0 |
| 0.7861111111111111 | 0 |
| 0.7868055555555555 | 0 |
| 0.7875 | 0 |
| 0.7881944444444445 | 0 |
| 0.7888888888888889 | 0 |
| 0.7895833333333333 | 0 |
| 0.7902777777777777 | 0 |
| 0.7909722222222223 | 0 |
| 0.7916666666666666 | 0 |
| 0.7923611111111111 | 0 |
| 0.7930555555555556 | 0 |
| 0.7937500000000001 | 0 |
| 0.7944444444444444 | 0 |
| 0.7951388888888888 | 0 |
| 0.7958333333333334 | 0 |
| 0.7965277777777778 | 0 |
| 0.7972222222222222 | 0 |
| 0.7979166666666666 | 0 |
| 0.7986111111111112 | 0 |
| 0.7993055555555556 | 0 |
| 0.7999999999999999 | 0 |
| 0.8006944444444444 | 0 |
| 0.8013888888888889 | 0 |
| 0.8020833333333334 | 0 |
| 0.8027777777777777 | 0 |
| 0.8034722222222223 | 0 |
| 0.8041666666666667 | 0 |
| 0.8048611111111111 | 0 |
| 0.8055555555555555 | 0 |
| 0.80625 | 0 |
| 0.8069444444444445 | 0 |
| 0.8076388888888889 | 0 |
| 0.8083333333333332 | 0 |
| 0.8090277777777778 | 0 |
| 0.8097222222222222 | 0 |
| 0.8104166666666667 | 0 |
| 0.811111111111111 | 0 |
| 0.8118055555555556 | 0 |
| 0.8125 | 0 |
| 0.8131944444444444 | 0 |
| 0.813888888888889 | 0 |
| 0.8145833333333333 | 0 |
| 0.8152777777777778 | 0 |
| 0.8159722222222222 | 0 |
| 0.8166666666666668 | 0 |
| 0.8173611111111111 | 0 |
| 0.8180555555555555 | 0 |
| 0.81875 | 0 |
| 0.8194444444444445 | 0 |
| 0.8201388888888889 | 0 |
| 0.8208333333333333 | 0 |
| 0.8215277777777777 | 0 |
| 0.8222222222222223 | 0 |
| 0.8229166666666666 | 0 |
| 0.8236111111111111 | 0 |
| 0.8243055555555556 | 0 |
| 0.8250000000000001 | 0 |
| 0.8256944444444444 | 0 |
| 0.8263888888888888 | 0 |
| 0.8270833333333334 | 0 |
| 0.8277777777777778 | 0 |
| 0.8284722222222222 | 0 |
| 0.8291666666666666 | 0 |
| 0.8298611111111112 | 0 |
| 0.8305555555555556 | 0 |
| 0.8312499999999999 | 0 |
| 0.8319444444444444 | 0 |
| 0.8326388888888889 | 0 |
| 0.8333333333333334 | 0 |
| 0.8340277777777777 | 0 |
| 0.8347222222222223 | 0 |
| 0.8354166666666667 | 0 |
| 0.8361111111111111 | 0 |
| 0.8368055555555555 | 0 |
| 0.8375 | 0 |
| 0.8381944444444445 | 0 |
| 0.8388888888888889 | 0 |
| 0.8395833333333332 | 0 |
| 0.8402777777777778 | 0 |
| 0.8409722222222222 | 0 |
| 0.8416666666666667 | 0 |
| 0.842361111111111 | 0 |
| 0.8430555555555556 | 0 |
| 0.84375 | 0 |
| 0.8444444444444444 | 0 |
| 0.845138888888889 | 0 |
| 0.8458333333333333 | 0 |
| 0.8465277777777778 | 0 |
| 0.8472222222222222 | 0 |
| 0.8479166666666668 | 0 |
| 0.8486111111111111 | 0 |
| 0.8493055555555555 | 0 |
| 0.85 | 0 |
| 0.8506944444444445 | 0 |
| 0.8513888888888889 | 0 |
| 0.8520833333333333 | 0 |
| 0.8527777777777777 | 0 |
| 0.8534722222222223 | 0 |
| 0.8541666666666666 | 0 |
| 0.8548611111111111 | 0 |
| 0.8555555555555556 | 0 |
| 0.8562500000000001 | 0 |
| 0.8569444444444444 | 0 |
| 0.8576388888888888 | 0 |
| 0.8583333333333334 | 0 |
| 0.8590277777777778 | 0 |
| 0.8597222222222222 | 0 |
| 0.8604166666666666 | 0 |
| 0.8611111111111112 | 0 |
| 0.8618055555555556 | 0 |
| 0.8624999999999999 | 0 |
| 0.8631944444444444 | 0 |
| 0.8638888888888889 | 0 |
| 0.8645833333333334 | 0 |
| 0.8652777777777777 | 0 |
| 0.8659722222222223 | 0 |
| 0.8666666666666667 | 0 |
| 0.8673611111111111 | 0 |
| 0.8680555555555555 | 0 |
| 0.86875 | 0 |
| 0.8694444444444445 | 0 |
| 0.8701388888888889 | 0 |
| 0.8708333333333332 | 0 |
| 0.8715277777777778 | 0 |
| 0.8722222222222222 | 0 |
| 0.8729166666666667 | 0 |
| 0.873611111111111 | 0 |
| 0.8743055555555556 | 0 |
| 0.875 | 0 |
| 0.8756944444444444 | 0 |
| 0.876388888888889 | 0 |
| 0.8770833333333333 | 0 |
| 0.8777777777777778 | 0 |
| 0.8784722222222222 | 0 |
| 0.8791666666666668 | 0 |
| 0.8798611111111111 | 0 |
| 0.8805555555555555 | 0 |
| 0.88125 | 0 |
| 0.8819444444444445 | 0 |
| 0.8826388888888889 | 0 |
| 0.8833333333333333 | 0 |
| 0.8840277777777777 | 0 |
| 0.8847222222222223 | 0 |
| 0.8854166666666666 | 0 |
| 0.8861111111111111 | 0 |
| 0.8868055555555556 | 0 |
| 0.8875000000000001 | 0 |
| 0.8881944444444444 | 0 |
| 0.8888888888888888 | 0 |
| 0.8895833333333334 | 0 |
| 0.8902777777777778 | 0 |
| 0.8909722222222222 | 0 |
| 0.8916666666666666 | 0 |
| 0.8923611111111112 | 0 |
| 0.8930555555555556 | 0 |
| 0.8937499999999999 | 0 |
| 0.8944444444444444 | 0 |
| 0.8951388888888889 | 0 |
| 0.8958333333333334 | 0 |
| 0.8965277777777777 | 0 |
| 0.8972222222222223 | 0 |
| 0.8979166666666667 | 0 |
| 0.8986111111111111 | 0 |
| 0.8993055555555555 | 0 |
| 0.9 | 0 |
| 0.9006944444444445 | 0 |
| 0.9013888888888889 | 0 |
| 0.9020833333333332 | 0 |
| 0.9027777777777778 | 0 |
| 0.9034722222222222 | 0 |
| 0.9041666666666667 | 0 |
| 0.904861111111111 | 0 |
| 0.9055555555555556 | 0 |
| 0.90625 | 0 |
| 0.9069444444444444 | 0 |
| 0.907638888888889 | 0 |
| 0.9083333333333333 | 0 |
| 0.9090277777777778 | 0 |
| 0.9097222222222222 | 0 |
| 0.9104166666666668 | 0 |
| 0.9111111111111111 | 0 |
| 0.9118055555555555 | 0 |
| 0.9125 | 0 |
| 0.9131944444444445 | 0 |
| 0.9138888888888889 | 0 |
| 0.9145833333333333 | 0 |
| 0.9152777777777777 | 0 |
| 0.9159722222222223 | 0 |
| 0.9166666666666666 | 0 |
| 0.9173611111111111 | 0 |
| 0.9180555555555556 | 0 |
| 0.9187500000000001 | 0 |
| 0.9194444444444444 | 0 |
| 0.9201388888888888 | 0 |
| 0.9208333333333334 | 0 |
| 0.9215277777777778 | 0 |
| 0.9222222222222222 | 0 |
| 0.9229166666666666 | 0 |
| 0.9236111111111112 | 0 |
| 0.9243055555555556 | 0 |
| 0.9249999999999999 | 0 |
| 0.9256944444444444 | 0 |
| 0.9263888888888889 | 0 |
| 0.9270833333333334 | 0 |
| 0.9277777777777777 | 0 |
| 0.9284722222222223 | 0 |
| 0.9291666666666667 | 0 |
| 0.9298611111111111 | 0 |
| 0.9305555555555555 | 0 |
| 0.93125 | 0 |
| 0.9319444444444445 | 0 |
| 0.9326388888888889 | 0 |
| 0.9333333333333332 | 0 |
| 0.9340277777777778 | 0 |
| 0.9347222222222222 | 0 |
| 0.9354166666666667 | 0 |
| 0.936111111111111 | 0 |
| 0.9368055555555556 | 0 |
| 0.9375 | 0 |
| 0.9381944444444444 | 0 |
| 0.938888888888889 | 0 |
| 0.9395833333333333 | 0 |
| 0.9402777777777778 | 0 |
| 0.9409722222222222 | 0 |
| 0.9416666666666668 | 0 |
| 0.9423611111111111 | 0 |
| 0.9430555555555555 | 0 |
| 0.94375 | 0 |
| 0.9444444444444445 | 0 |
| 0.9451388888888889 | 0 |
| 0.9458333333333333 | 0 |
| 0.9465277777777777 | 0 |
| 0.9472222222222223 | 0 |
| 0.9479166666666666 | 0 |
| 0.9486111111111111 | 0 |
| 0.9493055555555556 | 0 |
| 0.9500000000000001 | 0 |
| 0.9506944444444444 | 0 |
| 0.9513888888888888 | 0 |
| 0.9520833333333334 | 0 |
| 0.9527777777777778 | 0 |
| 0.9534722222222222 | 0 |
| 0.9541666666666666 | 0 |
| 0.9548611111111112 | 0 |
| 0.9555555555555556 | 0 |
| 0.9562499999999999 | 0 |
| 0.9569444444444444 | 0 |
| 0.9576388888888889 | 0 |
| 0.9583333333333334 | 0 |
| 0.9590277777777777 | 0 |
| 0.9597222222222223 | 0 |
| 0.9604166666666667 | 0 |
| 0.9611111111111111 | 0 |
| 0.9618055555555555 | 0 |
| 0.9625 | 0 |
| 0.9631944444444445 | 0 |
| 0.9638888888888889 | 0 |
| 0.9645833333333332 | 0 |
| 0.9652777777777778 | 0 |
| 0.9659722222222222 | 0 |
| 0.9666666666666667 | 0 |
| 0.967361111111111 | 0 |
| 0.9680555555555556 | 0 |
| 0.96875 | 0 |
| 0.9694444444444444 | 0 |
| 0.970138888888889 | 0 |
| 0.9708333333333333 | 0 |
| 0.9715277777777778 | 0 |
| 0.9722222222222222 | 0 |
| 0.9729166666666668 | 0 |
| 0.9736111111111111 | 0 |
| 0.9743055555555555 | 0 |
| 0.975 | 0 |
| 0.9756944444444445 | 0 |
| 0.9763888888888889 | 0 |
| 0.9770833333333333 | 0 |
| 0.9777777777777777 | 0 |
| 0.9784722222222223 | 0 |
| 0.9791666666666666 | 0 |
| 0.9798611111111111 | 0 |
| 0.9805555555555556 | 0 |
| 0.9812500000000001 | 0 |
| 0.9819444444444444 | 0 |
| 0.9826388888888888 | 0 |
| 0.9833333333333334 | 0 |
| 0.9840277777777778 | 0 |
| 0.9847222222222222 | 0 |
| 0.9854166666666666 | 0 |
| 0.9861111111111112 | 0 |
| 0.9868055555555556 | 0 |
| 0.9874999999999999 | 0 |
| 0.9881944444444444 | 0 |
| 0.9888888888888889 | 0 |
| 0.9895833333333334 | 0 |
| 0.9902777777777777 | 0 |
| 0.9909722222222223 | 0 |
| 0.9916666666666667 | 0 |
| 0.9923611111111111 | 0 |
| 0.9930555555555555 | 0 |
| 0.99375 | 0 |
| 0.9944444444444445 | 0 |
| 0.9951388888888889 | 0 |
| 0.9958333333333332 | 0 |
| 0.9965277777777778 | 0 |
| 0.9972222222222222 | 0 |
| 0.9979166666666667 | 0 |
| 0.998611111111111 | 0 |
| 0.9993055555555556 | 0 |